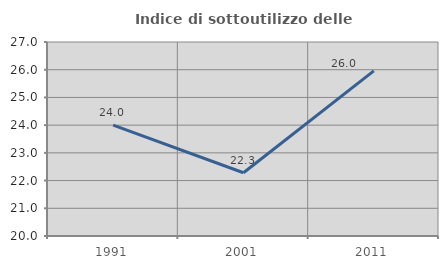
| Category | Indice di sottoutilizzo delle abitazioni  |
|---|---|
| 1991.0 | 24.003 |
| 2001.0 | 22.281 |
| 2011.0 | 25.959 |